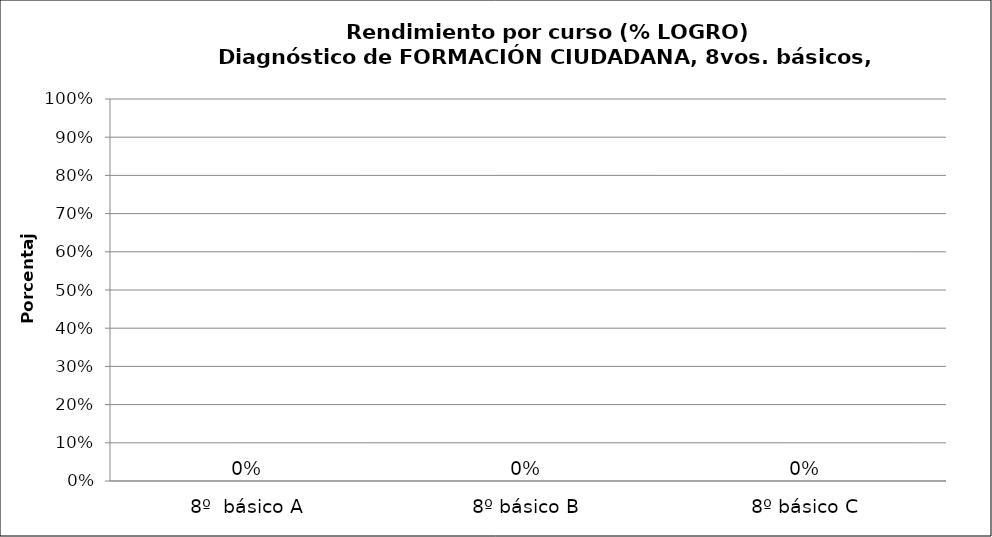
| Category | Series 0 |
|---|---|
| 8º  básico A | 0 |
| 8º básico B | 0 |
| 8º básico C | 0 |